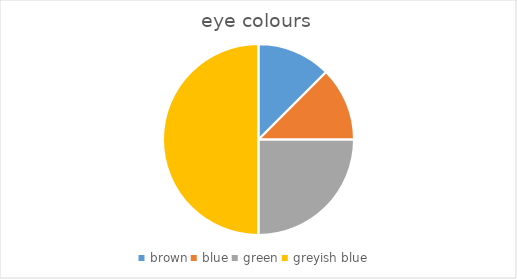
| Category | Series 0 |
|---|---|
| brown | 1 |
| blue | 1 |
| green | 2 |
| greyish blue | 4 |